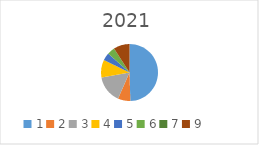
| Category | Series 0 |
|---|---|
| 1.0 | 6996533.45 |
| 2.0 | 995272.76 |
| 3.0 | 2202736.14 |
| 4.0 | 1418860.12 |
| 5.0 | 611801.42 |
| 6.0 | 611801.42 |
| 7.0 | 0 |
| 9.0 | 1287810.39 |